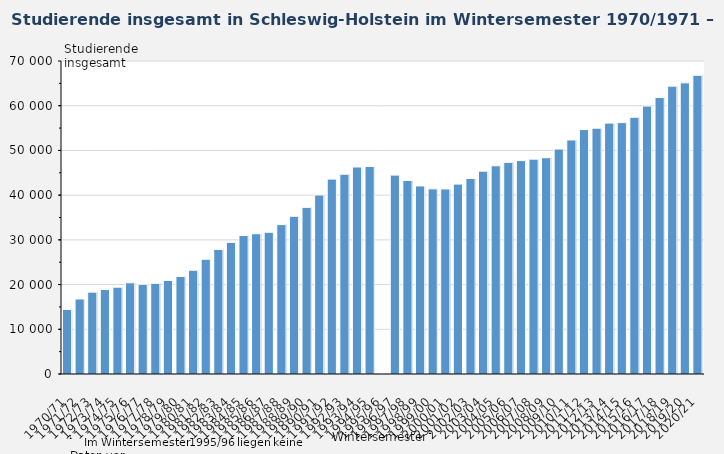
| Category | Studierende insgesamt |
|---|---|
| 1970/71 | 14430 |
| 1971/72 | 16771 |
| 1972/73 | 18307 |
| 1973/74 | 18913 |
| 1974/75 | 19425 |
| 1975/76 | 20396 |
| 1976/77 | 20064 |
| 1977/78 | 20277 |
| 1978/79 | 20908 |
| 1979/80 | 21805 |
| 1980/81 | 23208 |
| 1981/82 | 25661 |
| 1982/83 | 27864 |
| 1983/84 | 29443 |
| 1984/85 | 30964 |
| 1985/86 | 31372 |
| 1986/87 | 31697 |
| 1987/88 | 33407 |
| 1988/89 | 35272 |
| 1989/90 | 37266 |
| 1990/91 | 40036 |
| 1991/92 | 43584 |
| 1992/93 | 44686 |
| 1993/94 | 46297 |
| 1994/95 | 46414 |
| 1995/96 | 0 |
| 1996/97 | 44478 |
| 1997/98 | 43277 |
| 1998/99 | 42061 |
| 1999/00 | 41405 |
| 2000/01 | 41387 |
| 2001/02 | 42466 |
| 2002/03 | 43719 |
| 2003/04 | 45364 |
| 2004/05 | 46565 |
| 2005/06 | 47331 |
| 2006/07 | 47730 |
| 2007/08 | 48052 |
| 2008/09 | 48366 |
| 2009/10 | 50307 |
| 2010/11 | 52344 |
| 2011/12 | 54662 |
| 2012/13 | 54977 |
| 2013/14 | 56113 |
| 2014/15 | 56221 |
| 2015/16 | 57412 |
| 2016/17 | 59919 |
| 2017/18 | 61837 |
| 2018/19 | 64377 |
| 2019/20 | 65112 |
| 2020/21 | 66808 |